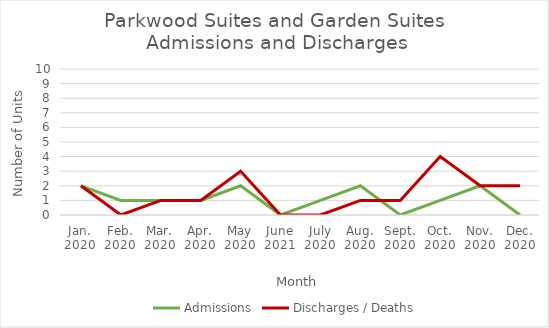
| Category | Admissions | Discharges / Deaths |
|---|---|---|
| Jan.
2020 | 2 | 2 |
| Feb.
2020 | 1 | 0 |
| Mar.
2020 | 1 | 1 |
| Apr.
2020 | 1 | 1 |
| May
2020 | 2 | 3 |
| June
2021 | 0 | 0 |
| July
2020 | 1 | 0 |
| Aug.
2020 | 2 | 1 |
| Sept.
2020 | 0 | 1 |
| Oct.
2020 | 1 | 4 |
| Nov.
2020 | 2 | 2 |
| Dec.
2020 | 0 | 2 |